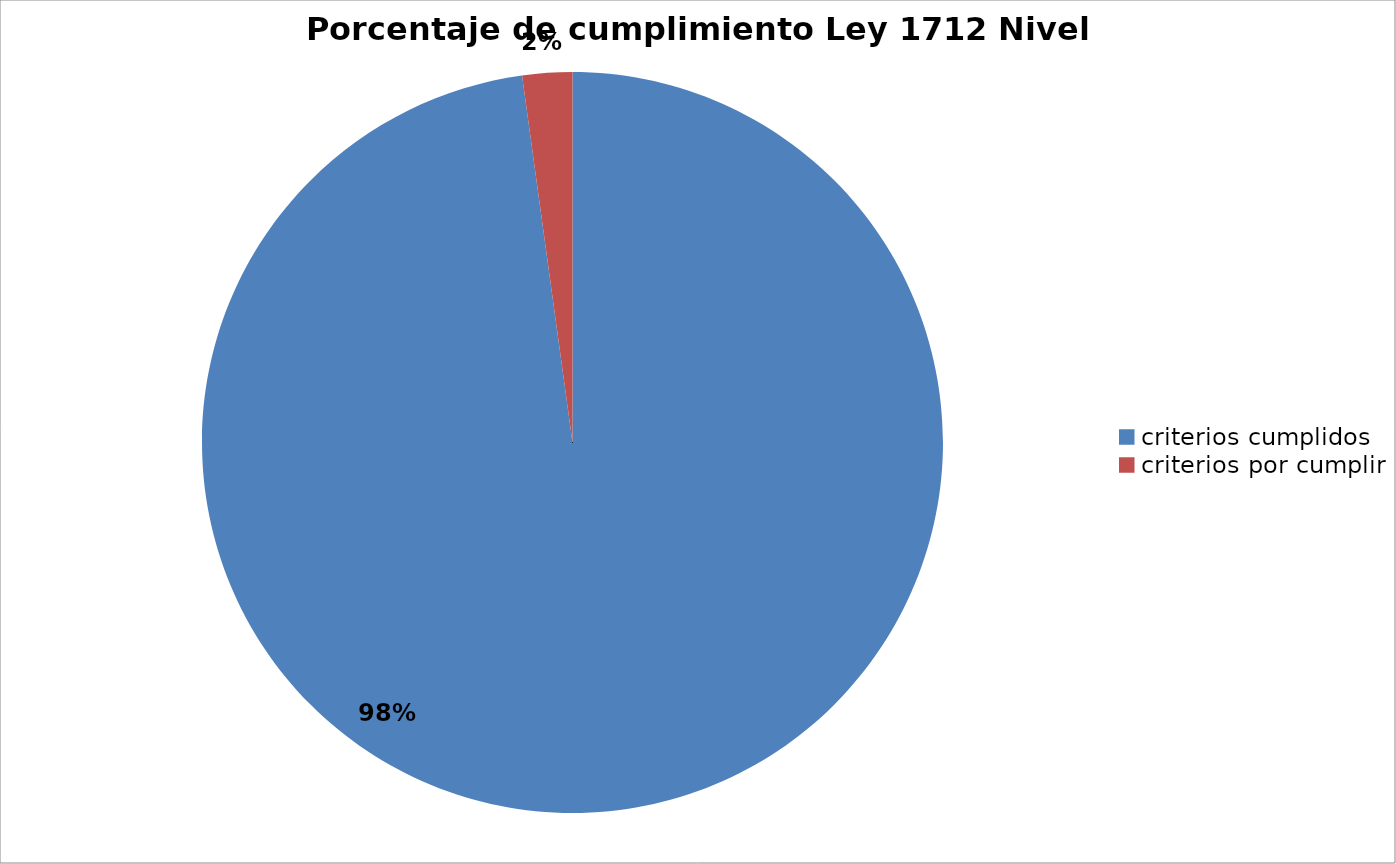
| Category | Series 0 |
|---|---|
| criterios cumplidos | 135 |
| criterios por cumplir | 3 |